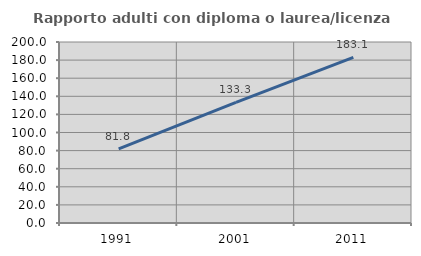
| Category | Rapporto adulti con diploma o laurea/licenza media  |
|---|---|
| 1991.0 | 81.846 |
| 2001.0 | 133.333 |
| 2011.0 | 183.11 |